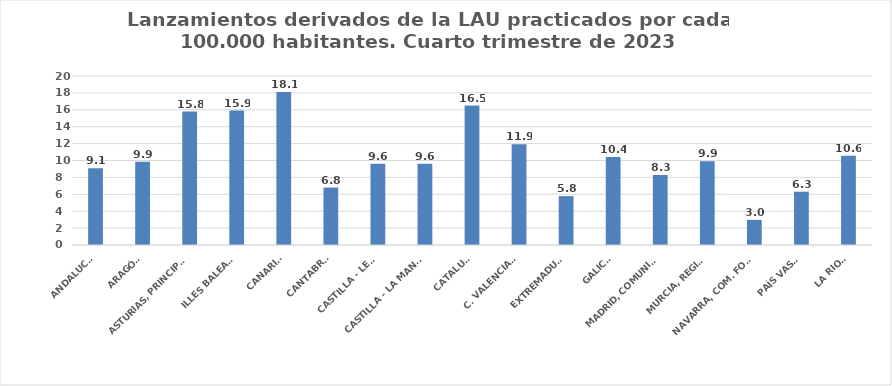
| Category | Series 0 |
|---|---|
| ANDALUCÍA | 9.091 |
| ARAGÓN | 9.857 |
| ASTURIAS, PRINCIPADO | 15.796 |
| ILLES BALEARS | 15.911 |
| CANARIAS | 18.121 |
| CANTABRIA | 6.797 |
| CASTILLA - LEÓN | 9.612 |
| CASTILLA - LA MANCHA | 9.612 |
| CATALUÑA | 16.508 |
| C. VALENCIANA | 11.92 |
| EXTREMADURA | 5.786 |
| GALICIA | 10.409 |
| MADRID, COMUNIDAD | 8.279 |
| MURCIA, REGIÓN | 9.918 |
| NAVARRA, COM. FORAL | 2.975 |
| PAÍS VASCO | 6.307 |
| LA RIOJA | 10.55 |